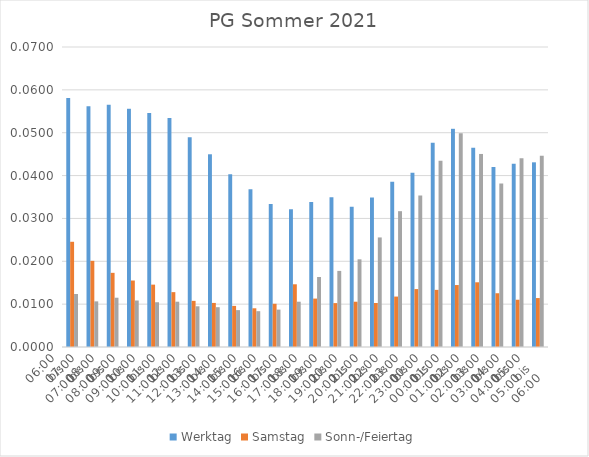
| Category | Werktag | Samstag | Sonn-/Feiertag |
|---|---|---|---|
| 06:00
bis
07:00 | 0.058 | 0.025 | 0.012 |
| 07:00
bis
08:00 | 0.056 | 0.02 | 0.011 |
| 08:00
bis
09:00 | 0.057 | 0.017 | 0.011 |
| 09:00
bis
10:00 | 0.056 | 0.016 | 0.011 |
| 10:00
bis
11:00 | 0.055 | 0.015 | 0.01 |
| 11:00
bis
12:00 | 0.053 | 0.013 | 0.011 |
| 12:00
bis
13:00 | 0.049 | 0.011 | 0.009 |
| 13:00
bis
14:00 | 0.045 | 0.01 | 0.009 |
| 14:00
bis
15:00 | 0.04 | 0.01 | 0.009 |
| 15:00
bis
16:00 | 0.037 | 0.009 | 0.008 |
| 16:00
bis
17:00 | 0.033 | 0.01 | 0.009 |
| 17:00
bis
18:00 | 0.032 | 0.015 | 0.011 |
| 18:00
bis
19:00 | 0.034 | 0.011 | 0.016 |
| 19:00
bis
20:00 | 0.035 | 0.01 | 0.018 |
| 20:00
bis
21:00 | 0.033 | 0.011 | 0.02 |
| 21:00
bis
22:00 | 0.035 | 0.01 | 0.026 |
| 22:00
bis
23:00 | 0.039 | 0.012 | 0.032 |
| 23:00
bis
00:00 | 0.041 | 0.014 | 0.035 |
| 00:00
bis
01:00 | 0.048 | 0.013 | 0.043 |
| 01:00
bis
02:00 | 0.051 | 0.014 | 0.05 |
| 02:00
bis
03:00 | 0.046 | 0.015 | 0.045 |
| 03:00
bis
04:00 | 0.042 | 0.013 | 0.038 |
| 04:00
bis
05:00 | 0.043 | 0.011 | 0.044 |
| 05:00
bis
06:00 | 0.043 | 0.011 | 0.045 |